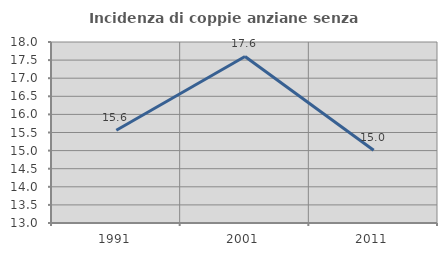
| Category | Incidenza di coppie anziane senza figli  |
|---|---|
| 1991.0 | 15.562 |
| 2001.0 | 17.601 |
| 2011.0 | 15.008 |